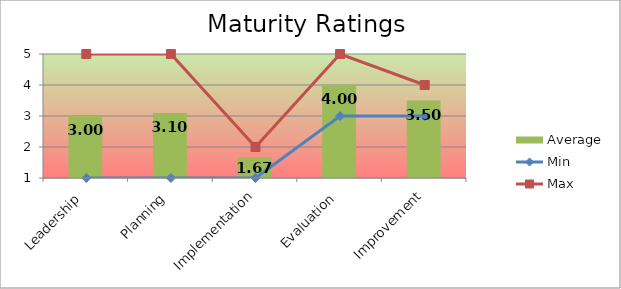
| Category | Average |
|---|---|
| Leadership | 3 |
| Planning | 3.1 |
| Implementation | 1.667 |
| Evaluation | 4 |
| Improvement | 3.5 |